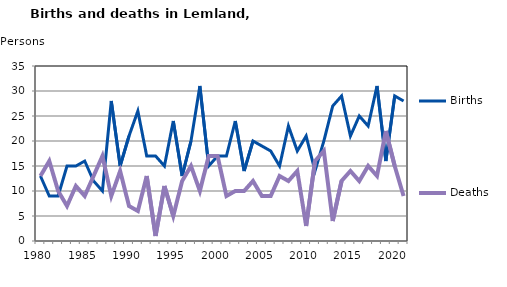
| Category | Births | Deaths |
|---|---|---|
| 1980.0 | 13 | 13 |
| 1981.0 | 9 | 16 |
| 1982.0 | 9 | 10 |
| 1983.0 | 15 | 7 |
| 1984.0 | 15 | 11 |
| 1985.0 | 16 | 9 |
| 1986.0 | 12 | 13 |
| 1987.0 | 10 | 17 |
| 1988.0 | 28 | 9 |
| 1989.0 | 15 | 14 |
| 1990.0 | 21 | 7 |
| 1991.0 | 26 | 6 |
| 1992.0 | 17 | 13 |
| 1993.0 | 17 | 1 |
| 1994.0 | 15 | 11 |
| 1995.0 | 24 | 5 |
| 1996.0 | 13 | 12 |
| 1997.0 | 20 | 15 |
| 1998.0 | 31 | 10 |
| 1999.0 | 15 | 17 |
| 2000.0 | 17 | 17 |
| 2001.0 | 17 | 9 |
| 2002.0 | 24 | 10 |
| 2003.0 | 14 | 10 |
| 2004.0 | 20 | 12 |
| 2005.0 | 19 | 9 |
| 2006.0 | 18 | 9 |
| 2007.0 | 15 | 13 |
| 2008.0 | 23 | 12 |
| 2009.0 | 18 | 14 |
| 2010.0 | 21 | 3 |
| 2011.0 | 14 | 16 |
| 2012.0 | 20 | 18 |
| 2013.0 | 27 | 4 |
| 2014.0 | 29 | 12 |
| 2015.0 | 21 | 14 |
| 2016.0 | 25 | 12 |
| 2017.0 | 23 | 15 |
| 2018.0 | 31 | 13 |
| 2019.0 | 16 | 22 |
| 2020.0 | 29 | 15 |
| 2021.0 | 28 | 9 |